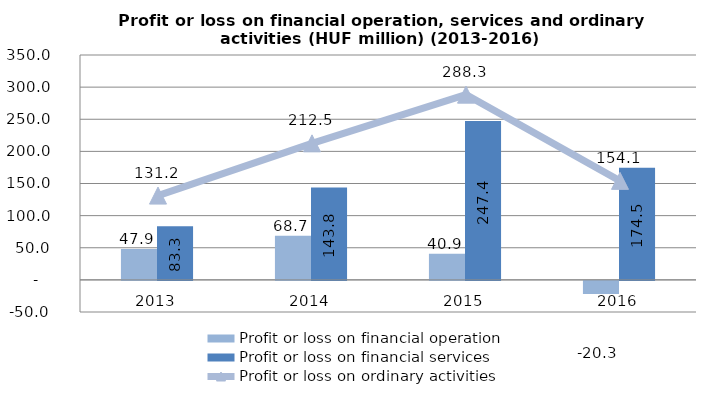
| Category | Profit or loss on financial operation | Profit or loss on financial services |
|---|---|---|
| 2013.0 | 47.9 | 83.3 |
| 2014.0 | 68.7 | 143.8 |
| 2015.0 | 40.852 | 247.438 |
| 2016.0 | -20.3 | 174.5 |